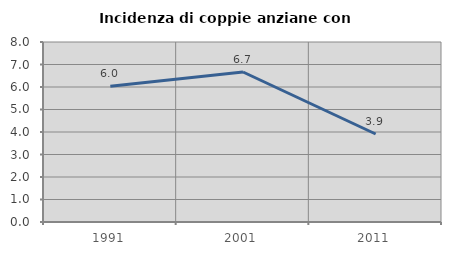
| Category | Incidenza di coppie anziane con figli |
|---|---|
| 1991.0 | 6.034 |
| 2001.0 | 6.667 |
| 2011.0 | 3.911 |